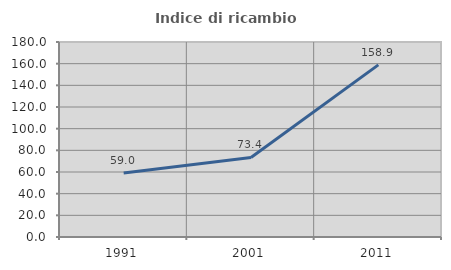
| Category | Indice di ricambio occupazionale  |
|---|---|
| 1991.0 | 58.986 |
| 2001.0 | 73.438 |
| 2011.0 | 158.904 |